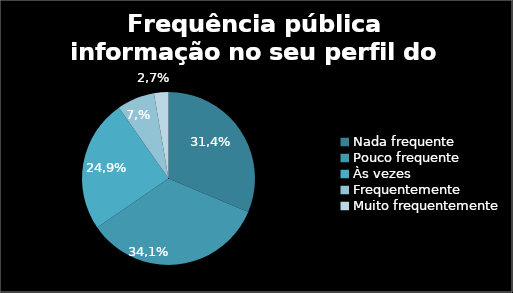
| Category | frequência publica informação no seu perfil do LinkedIn |
|---|---|
| Nada frequente | 31.351 |
| Pouco frequente | 34.054 |
| Às vezes | 24.865 |
| Frequentemente | 7.027 |
| Muito frequentemente | 2.703 |